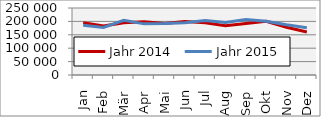
| Category | Jahr 2014 | Jahr 2015 |
|---|---|---|
| Jan | 194841 | 185329.453 |
| Feb | 182730 | 177453.929 |
| Mär | 194929 | 204360.197 |
| Apr | 199025 | 190820.088 |
| Mai | 191925 | 192118.166 |
| Jun | 199913 | 195240.452 |
| Jul | 195210 | 203062.614 |
| Aug | 184065 | 196020.543 |
| Sep | 192549 | 206728.822 |
| Okt | 200334 | 200229.068 |
| Nov | 178189 | 187151.106 |
| Dez | 160413 | 176645.148 |